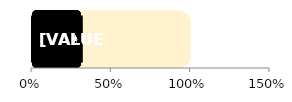
| Category | Total | Women |
|---|---|---|
| 0 | 1 | 0.32 |